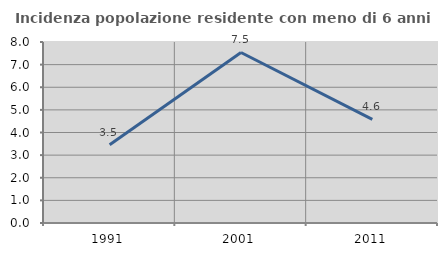
| Category | Incidenza popolazione residente con meno di 6 anni |
|---|---|
| 1991.0 | 3.458 |
| 2001.0 | 7.536 |
| 2011.0 | 4.582 |